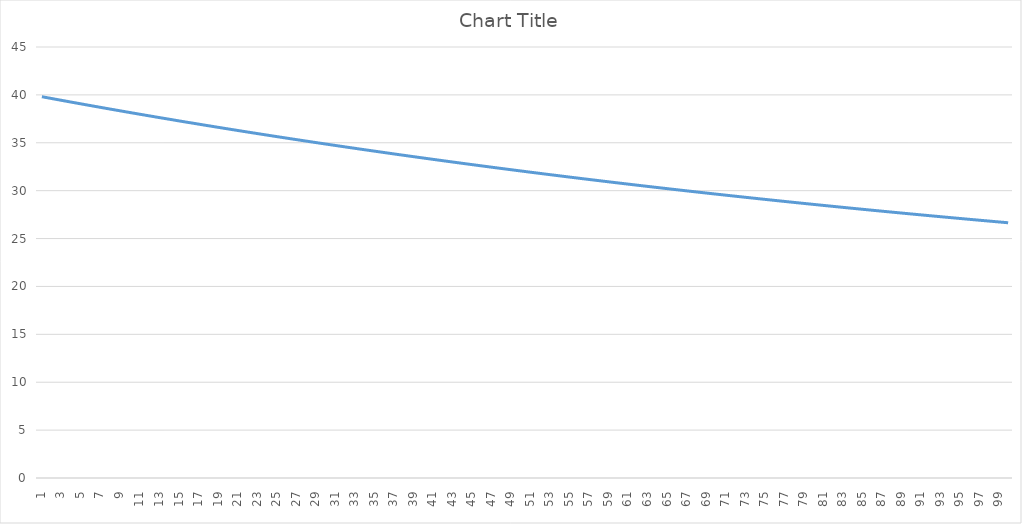
| Category | Series 0 |
|---|---|
| 1.0 | 39.81 |
| 2.0 | 39.621 |
| 3.0 | 39.434 |
| 4.0 | 39.248 |
| 5.0 | 39.064 |
| 6.0 | 38.88 |
| 7.0 | 38.699 |
| 8.0 | 38.519 |
| 9.0 | 38.34 |
| 10.0 | 38.162 |
| 11.0 | 37.986 |
| 12.0 | 37.811 |
| 13.0 | 37.638 |
| 14.0 | 37.465 |
| 15.0 | 37.295 |
| 16.0 | 37.125 |
| 17.0 | 36.957 |
| 18.0 | 36.79 |
| 19.0 | 36.624 |
| 20.0 | 36.459 |
| 21.0 | 36.296 |
| 22.0 | 36.134 |
| 23.0 | 35.973 |
| 24.0 | 35.814 |
| 25.0 | 35.656 |
| 26.0 | 35.498 |
| 27.0 | 35.342 |
| 28.0 | 35.188 |
| 29.0 | 35.034 |
| 30.0 | 34.882 |
| 31.0 | 34.731 |
| 32.0 | 34.58 |
| 33.0 | 34.432 |
| 34.0 | 34.284 |
| 35.0 | 34.137 |
| 36.0 | 33.991 |
| 37.0 | 33.847 |
| 38.0 | 33.704 |
| 39.0 | 33.561 |
| 40.0 | 33.42 |
| 41.0 | 33.28 |
| 42.0 | 33.141 |
| 43.0 | 33.003 |
| 44.0 | 32.866 |
| 45.0 | 32.73 |
| 46.0 | 32.595 |
| 47.0 | 32.461 |
| 48.0 | 32.329 |
| 49.0 | 32.197 |
| 50.0 | 32.066 |
| 51.0 | 31.936 |
| 52.0 | 31.807 |
| 53.0 | 31.68 |
| 54.0 | 31.553 |
| 55.0 | 31.427 |
| 56.0 | 31.302 |
| 57.0 | 31.178 |
| 58.0 | 31.055 |
| 59.0 | 30.933 |
| 60.0 | 30.811 |
| 61.0 | 30.691 |
| 62.0 | 30.572 |
| 63.0 | 30.453 |
| 64.0 | 30.336 |
| 65.0 | 30.219 |
| 66.0 | 30.103 |
| 67.0 | 29.989 |
| 68.0 | 29.875 |
| 69.0 | 29.761 |
| 70.0 | 29.649 |
| 71.0 | 29.538 |
| 72.0 | 29.427 |
| 73.0 | 29.317 |
| 74.0 | 29.208 |
| 75.0 | 29.1 |
| 76.0 | 28.993 |
| 77.0 | 28.887 |
| 78.0 | 28.781 |
| 79.0 | 28.676 |
| 80.0 | 28.572 |
| 81.0 | 28.469 |
| 82.0 | 28.366 |
| 83.0 | 28.265 |
| 84.0 | 28.164 |
| 85.0 | 28.064 |
| 86.0 | 27.964 |
| 87.0 | 27.866 |
| 88.0 | 27.768 |
| 89.0 | 27.671 |
| 90.0 | 27.574 |
| 91.0 | 27.479 |
| 92.0 | 27.384 |
| 93.0 | 27.29 |
| 94.0 | 27.196 |
| 95.0 | 27.103 |
| 96.0 | 27.011 |
| 97.0 | 26.92 |
| 98.0 | 26.829 |
| 99.0 | 26.739 |
| 100.0 | 26.65 |